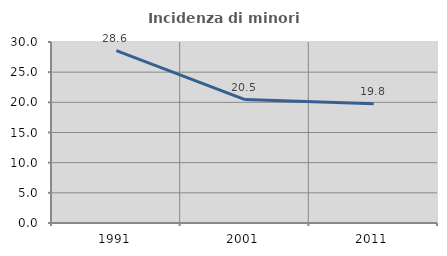
| Category | Incidenza di minori stranieri |
|---|---|
| 1991.0 | 28.571 |
| 2001.0 | 20.455 |
| 2011.0 | 19.78 |